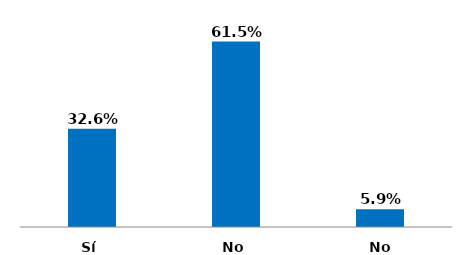
| Category | Series 0 |
|---|---|
| Sí | 0.326 |
| No | 0.615 |
| No responde | 0.059 |